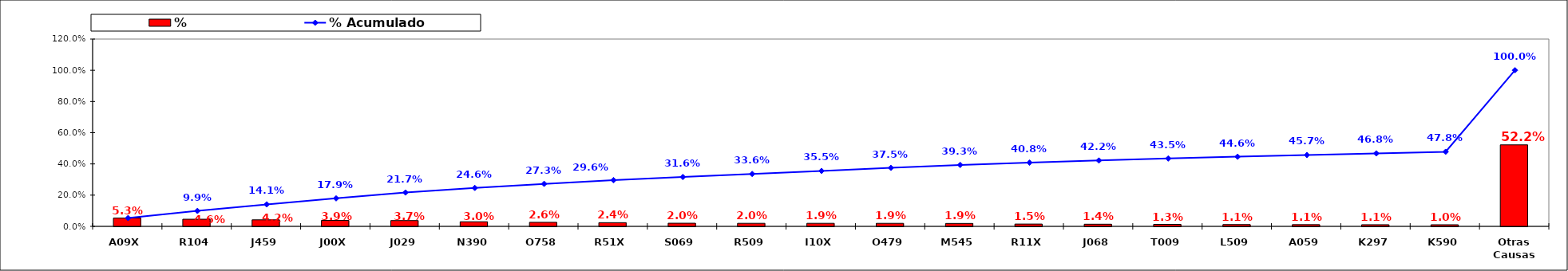
| Category | % |
|---|---|
| A09X | 0.053 |
| R104 | 0.046 |
| J459 | 0.042 |
| J00X | 0.039 |
| J029 | 0.037 |
| N390 | 0.03 |
| O758 | 0.026 |
| R51X | 0.024 |
| S069 | 0.02 |
| R509 | 0.02 |
| I10X | 0.019 |
| O479 | 0.019 |
| M545 | 0.019 |
| R11X | 0.015 |
| J068 | 0.014 |
| T009 | 0.013 |
| L509 | 0.011 |
| A059 | 0.011 |
| K297 | 0.011 |
| K590 | 0.01 |
| Otras Causas | 0.522 |